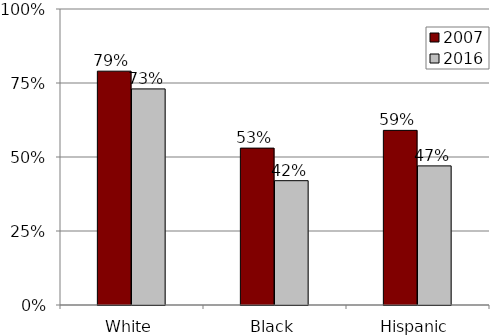
| Category | 2007 | 2016 |
|---|---|---|
| White | 0.79 | 0.73 |
| Black | 0.53 | 0.42 |
| Hispanic | 0.59 | 0.47 |